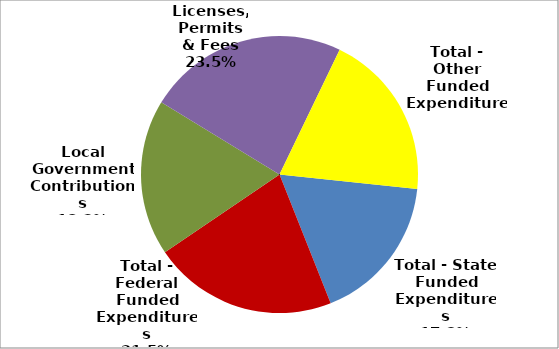
| Category | Series 0 |
|---|---|
| Total - State Funded Expenditures | 366535 |
| Total - Federal Funded Expenditures | 455639 |
| Local Government Contributions | 385731 |
| Licenses, Permits & Fees | 496073 |
| Total - Other Funded Expenditures | 413133 |